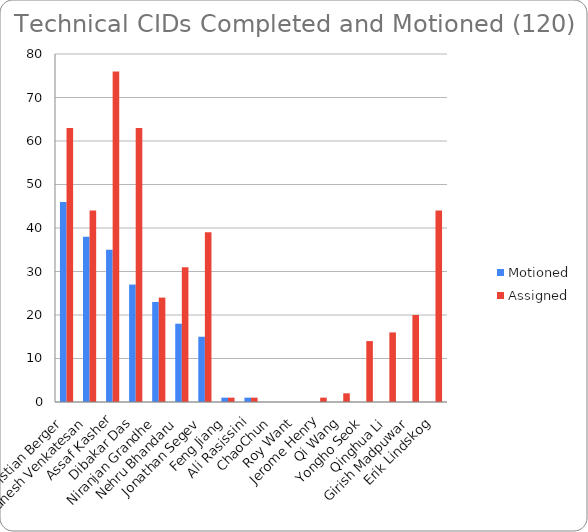
| Category | Motioned | Assigned |
|---|---|---|
| Christian Berger | 46 | 63 |
| Ganesh Venkatesan | 38 | 44 |
| Assaf Kasher | 35 | 76 |
| Dibakar Das | 27 | 63 |
| Niranjan Grandhe | 23 | 24 |
| Nehru Bhandaru | 18 | 31 |
| Jonathan Segev | 15 | 39 |
| Feng Jiang | 1 | 1 |
| Ali Rasissini | 1 | 1 |
| ChaoChun | 0 | 0 |
| Roy Want | 0 | 0 |
| Jerome Henry | 0 | 1 |
| Qi Wang | 0 | 2 |
| Yongho Seok | 0 | 14 |
| Qinghua Li | 0 | 16 |
| Girish Madpuwar | 0 | 20 |
| Erik Lindskog | 0 | 44 |